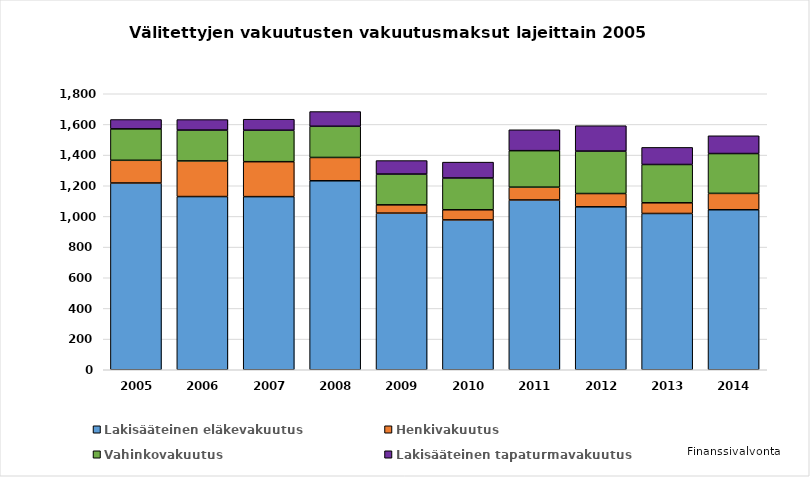
| Category | Lakisääteinen eläkevakuutus | Henkivakuutus | Vahinkovakuutus | Lakisääteinen tapaturmavakuutus |
|---|---|---|---|---|
| 2005.0 | 1218 | 148 | 205 | 61 |
| 2006.0 | 1129.49 | 232.47 | 201.056 | 68.612 |
| 2007.0 | 1129 | 228 | 205 | 72 |
| 2008.0 | 1232.449 | 151.996 | 203.425 | 95.962 |
| 2009.0 | 1021.457 | 54.107 | 200.56 | 88.041 |
| 2010.0 | 977.321 | 65.95 | 207.341 | 103.558 |
| 2011.0 | 1107.329 | 83.403 | 238.041 | 136.289 |
| 2012.0 | 1062.705 | 86.597 | 276.62 | 165.706 |
| 2013.0 | 1019.216 | 69.648 | 249.823 | 111.515 |
| 2014.0 | 1043.573 | 106.619 | 259.835 | 115.957 |